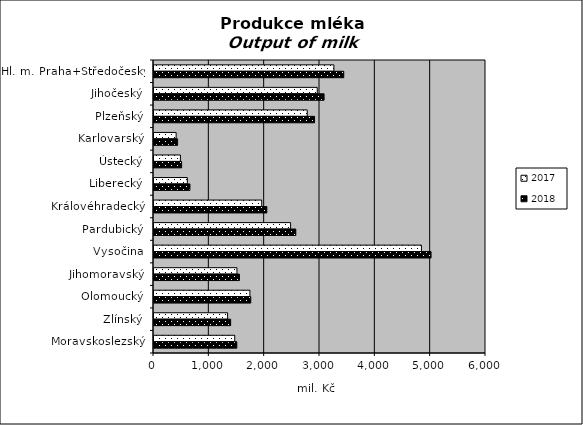
| Category | 2017 | 2018 |
|---|---|---|
| Hl. m. Praha+Středočeský | 3250.843 | 3429.389 |
| Jihočeský | 2950.529 | 3073.816 |
| Plzeňský | 2769.45 | 2901.588 |
| Karlovarský | 400.099 | 426.623 |
| Ústecký | 477.492 | 499.318 |
| Liberecký | 602.321 | 649.665 |
| Královéhradecký | 1946.367 | 2038.901 |
| Pardubický | 2468.695 | 2562.685 |
| Vysočina | 4833.335 | 5007.092 |
| Jihomoravský | 1498.915 | 1543.889 |
| Olomoucký | 1733.043 | 1748.514 |
| Zlínský | 1330.106 | 1385.21 |
| Moravskoslezský | 1459.082 | 1496.58 |